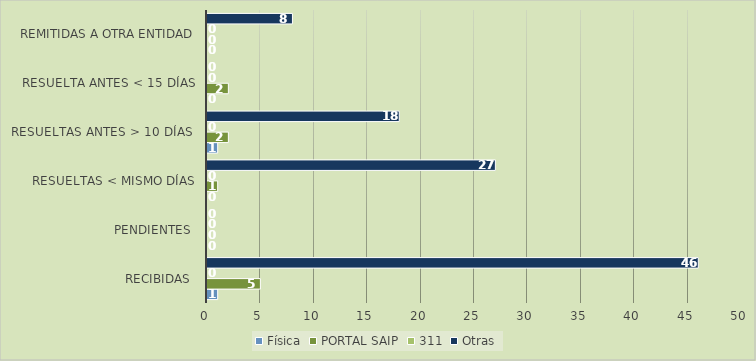
| Category | Física | PORTAL SAIP | 311 | Otras |
|---|---|---|---|---|
| Recibidas  | 1 | 5 | 0 | 46 |
| Pendientes  | 0 | 0 | 0 | 0 |
| Resueltas < mismo días | 0 | 1 | 0 | 27 |
| Resueltas antes > 10 días  | 1 | 2 | 0 | 18 |
| Resuelta antes < 15 días | 0 | 2 | 0 | 0 |
| Remitidas a otra entidad | 0 | 0 | 0 | 8 |